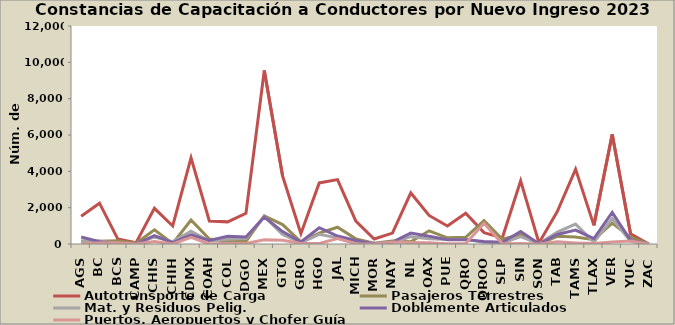
| Category | Autotransporte de Carga | Pasajeros Terrestres | Mat. y Residuos Pelig. | Doblemente Articulados | Puertos, Aeropuertos y Chofer Guía |
|---|---|---|---|---|---|
| AGS | 1524 | 140 | 181 | 383 | 17 |
| BC | 2247 | 152 | 171 | 124 | 57 |
| BCS | 281 | 185 | 31 | 0 | 67 |
| CAMP | 77 | 41 | 11 | 0 | 3 |
| CHIS | 1964 | 776 | 389 | 459 | 131 |
| CHIH | 992 | 27 | 132 | 76 | 0 |
| CDMX | 4738 | 1323 | 699 | 503 | 361 |
| COAH | 1265 | 271 | 163 | 198 | 0 |
| COL | 1218 | 155 | 256 | 421 | 44 |
| DGO | 1691 | 136 | 306 | 383 | 27 |
| MEX | 9548 | 1546 | 1520 | 1487 | 227 |
| GTO | 3739 | 1067 | 521 | 684 | 211 |
| GRO | 567 | 120 | 66 | 110 | 31 |
| HGO | 3363 | 600 | 530 | 896 | 30 |
| JAL | 3546 | 922 | 337 | 438 | 301 |
| MICH | 1256 | 282 | 152 | 196 | 15 |
| MOR | 273 | 42 | 48 | 10 | 0 |
| NAY | 599 | 166 | 66 | 107 | 109 |
| NL | 2811 | 125 | 405 | 603 | 80 |
| OAX | 1571 | 727 | 282 | 429 | 65 |
| PUE | 994 | 338 | 241 | 232 | 17 |
| QRO | 1692 | 366 | 254 | 232 | 23 |
| QROO | 626 | 1289 | 98 | 138 | 1148 |
| SLP | 340 | 263 | 48 | 94 | 10 |
| SIN | 3476 | 515 | 408 | 684 | 33 |
| SON | 58 | 5 | 7 | 15 | 5 |
| TAB | 1785 | 423 | 650 | 524 | 120 |
| TAMS | 4120 | 386 | 1094 | 766 | 61 |
| TLAX | 1025 | 241 | 97 | 297 | 21 |
| VER | 6035 | 1147 | 1402 | 1738 | 108 |
| YUC | 567 | 370 | 152 | 201 | 170 |
| ZAC | 0 | 0 | 0 | 0 | 0 |